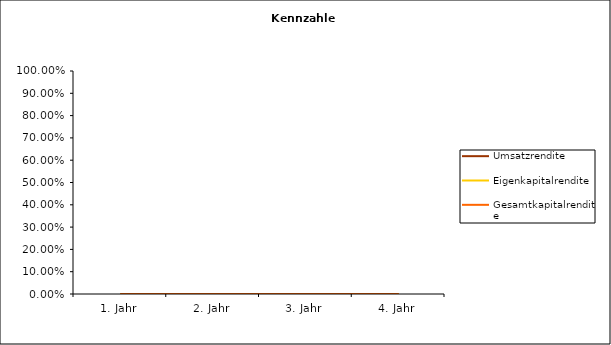
| Category | Umsatzrendite | Eigenkapitalrendite | Gesamtkapitalrendite |
|---|---|---|---|
| 1. Jahr | 0 | 0 | 0 |
| 2. Jahr | 0 | 0 | 0 |
| 3. Jahr | 0 | 0 | 0 |
| 4. Jahr | 0 | 0 | 0 |